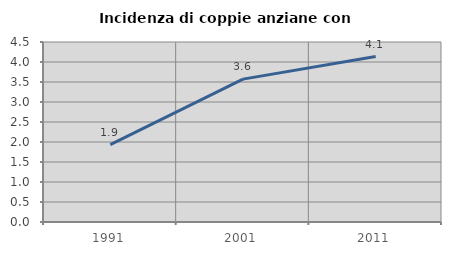
| Category | Incidenza di coppie anziane con figli |
|---|---|
| 1991.0 | 1.935 |
| 2001.0 | 3.571 |
| 2011.0 | 4.137 |